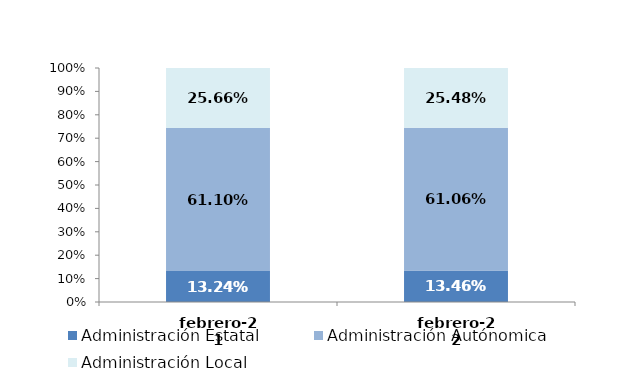
| Category | Administración Estatal | Administración Autónomica | Administración Local |
|---|---|---|---|
| 2021-02-01 | 0.132 | 0.611 | 0.257 |
| 2022-02-01 | 0.135 | 0.611 | 0.255 |